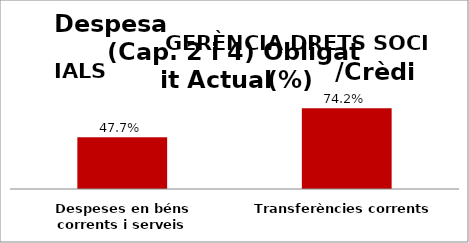
| Category | Series 0 |
|---|---|
| Despeses en béns corrents i serveis | 0.477 |
| Transferències corrents | 0.742 |